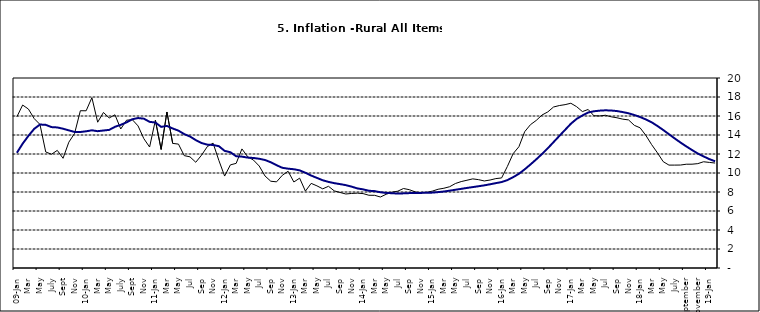
| Category | Series 0 | Series 1 |
|---|---|---|
| 09-Jan | 15.918 | 12.128 |
| Feb | 17.154 | 13.086 |
| Mar | 16.729 | 13.912 |
| Apr | 15.727 | 14.644 |
| May | 15.113 | 15.104 |
| June | 12.213 | 15.067 |
| July | 11.974 | 14.832 |
| Aug | 12.38 | 14.796 |
| Sept | 11.548 | 14.661 |
| Oct | 13.242 | 14.488 |
| Nov | 14.164 | 14.321 |
|  | 16.557 | 14.316 |
| 10-Jan | 16.548 | 14.39 |
| Feb | 17.934 | 14.494 |
| Mar | 15.346 | 14.401 |
| Apr | 16.373 | 14.473 |
| May | 15.794 | 14.54 |
| June | 16.126 | 14.862 |
| July | 14.634 | 15.072 |
| Aug | 15.556 | 15.33 |
| Sept | 15.616 | 15.658 |
| Oct | 14.955 | 15.786 |
| Nov | 13.616 | 15.719 |
| Dec | 12.735 | 15.385 |
| 11-Jan | 15.553 | 15.311 |
| Feb | 12.482 | 14.856 |
| Mar | 16.422 | 14.956 |
| Apr | 13.117 | 14.687 |
| May | 13.041 | 14.457 |
| Jun | 11.83 | 14.095 |
| Jul | 11.699 | 13.84 |
| Aug | 11.13 | 13.464 |
| Sep | 11.878 | 13.156 |
| Oct | 12.778 | 12.985 |
| Nov | 13.147 | 12.95 |
| Dec | 11.326 | 12.824 |
| 12-Jan | 9.678 | 12.33 |
| Feb | 10.856 | 12.188 |
| Mar | 11.014 | 11.76 |
| Apr | 12.536 | 11.724 |
| May | 11.712 | 11.621 |
| Jun | 11.36 | 11.582 |
| Jul | 10.733 | 11.499 |
| Aug | 9.683 | 11.368 |
| Sep | 9.132 | 11.131 |
| Oct | 9.071 | 10.82 |
| Nov | 9.758 | 10.548 |
| Dec | 10.183 | 10.455 |
| 13-Jan | 9.052 | 10.394 |
| Feb | 9.457 | 10.276 |
| Mar | 8.091 | 10.025 |
| Apr | 8.907 | 9.732 |
| May | 8.647 | 9.483 |
| Jun | 8.333 | 9.236 |
| Jul | 8.6 | 9.063 |
| Aug | 8.12 | 8.933 |
| Sep | 7.95 | 8.832 |
| Oct | 7.791 | 8.722 |
| Nov | 7.849 | 8.565 |
| Dec | 7.879 | 8.378 |
| 14-Jan | 7.832 | 8.277 |
| Feb | 7.657 | 8.13 |
| Mar | 7.65 | 8.092 |
| Apr | 7.473 | 7.973 |
| May | 7.761 | 7.901 |
| Jun | 7.98 | 7.874 |
| Jul | 8.086 | 7.834 |
| Aug | 8.368 | 7.858 |
| Sep | 8.244 | 7.883 |
| Oct | 8.019 | 7.903 |
| Nov | 7.898 | 7.906 |
| Dec | 7.955 | 7.913 |
| 15-Jan | 8.094 | 7.935 |
| Feb | 8.291 | 7.988 |
| Mar | 8.396 | 8.05 |
| Apr | 8.556 | 8.14 |
| May | 8.896 | 8.236 |
| Jun | 9.098 | 8.331 |
| Jul | 9.238 | 8.429 |
| Aug | 9.382 | 8.516 |
| Sep | 9.3 | 8.606 |
| Oct | 9.162 | 8.7 |
| Nov | 9.261 | 8.813 |
| Dec | 9.41 | 8.933 |
| 16-Jan | 9.48 | 9.047 |
| Feb | 10.692 | 9.249 |
| Mar | 12.038 | 9.559 |
| Apr | 12.767 | 9.917 |
| May | 14.349 | 10.384 |
| Jun | 15.088 | 10.897 |
| Jul | 15.533 | 11.433 |
| Aug | 16.103 | 12.002 |
| Sep | 16.428 | 12.601 |
| Oct | 16.947 | 13.25 |
| Nov | 17.099 | 13.898 |
| Dec | 17.195 | 14.54 |
| 17-Jan | 17.341 | 15.183 |
| Feb | 16.982 | 15.696 |
| Mar | 16.466 | 16.054 |
| Apr | 16.687 | 16.369 |
| May | 16.023 | 16.497 |
| Jun | 16.007 | 16.563 |
| Jul | 16.078 | 16.6 |
| Aug | 15.914 | 16.577 |
| Sep | 15.812 | 16.52 |
| Oct | 15.666 | 16.411 |
| Nov | 15.587 | 16.285 |
| Dec | 15.018 | 16.104 |
| 18-Jan | 14.756 | 15.892 |
| Feb | 13.957 | 15.638 |
| Mar | 12.987 | 15.339 |
| Apr | 12.126 | 14.95 |
| May | 11.199 | 14.53 |
| June | 10.832 | 14.083 |
| July | 10.831 | 13.636 |
| August | 10.838 | 13.209 |
| September | 10.924 | 12.804 |
| October | 10.927 | 12.418 |
| November | 10.986 | 12.049 |
| December | 11.183 | 11.746 |
| 19-Jan | 11.115 | 11.462 |
| February | 11.048 | 11.234 |